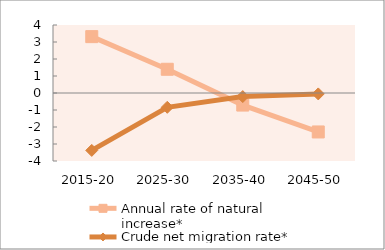
| Category | Annual rate of natural increase* | Crude net migration rate* |
|---|---|---|
| 2015-20 | 3.316 | -3.377 |
| 2025-30 | 1.396 | -0.841 |
| 2035-40 | -0.71 | -0.211 |
| 2045-50 | -2.292 | -0.054 |